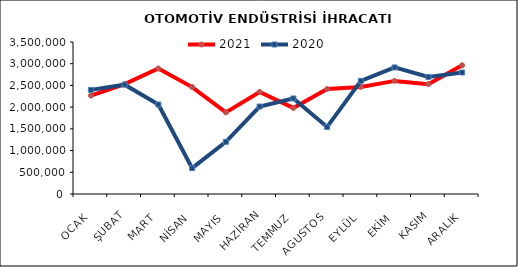
| Category | 2021 | 2020 |
|---|---|---|
| OCAK | 2266244.627 | 2398086.761 |
| ŞUBAT | 2530838.675 | 2517883.926 |
| MART | 2890129.528 | 2060399.289 |
| NİSAN | 2462199.587 | 596327.391 |
| MAYIS | 1880244.107 | 1202335.358 |
| HAZİRAN | 2350290.489 | 2014182.468 |
| TEMMUZ | 1981857.694 | 2199836.664 |
| AGUSTOS | 2417969.238 | 1543625.336 |
| EYLÜL | 2465443.851 | 2604387.226 |
| EKİM | 2604237.038 | 2914054.421 |
| KASIM | 2529570.933 | 2696294.166 |
| ARALIK | 2963769.069 | 2797534.357 |